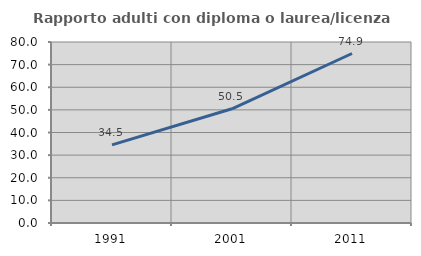
| Category | Rapporto adulti con diploma o laurea/licenza media  |
|---|---|
| 1991.0 | 34.512 |
| 2001.0 | 50.481 |
| 2011.0 | 74.913 |